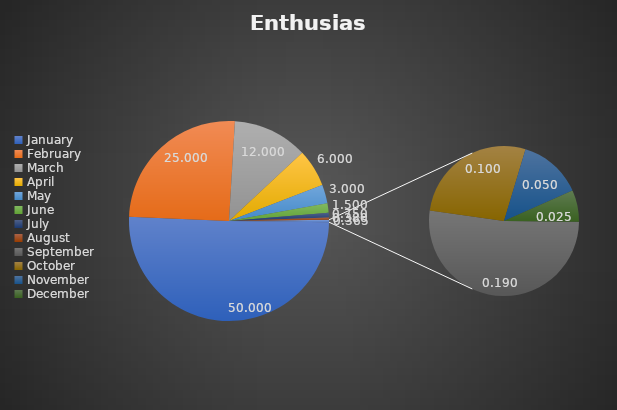
| Category | Enthusiasm |
|---|---|
| January | 50 |
| February | 25 |
| March | 12 |
| April | 6 |
| May | 3 |
| June | 1.5 |
| July | 0.75 |
| August | 0.38 |
| September | 0.19 |
| October | 0.1 |
| November | 0.05 |
| December | 0.025 |